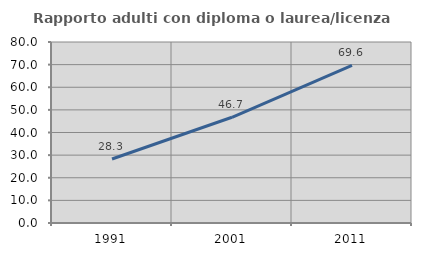
| Category | Rapporto adulti con diploma o laurea/licenza media  |
|---|---|
| 1991.0 | 28.305 |
| 2001.0 | 46.722 |
| 2011.0 | 69.628 |